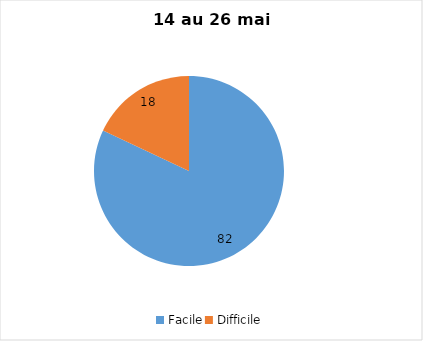
| Category | Series 0 |
|---|---|
| Facile | 82 |
| Difficile | 18 |